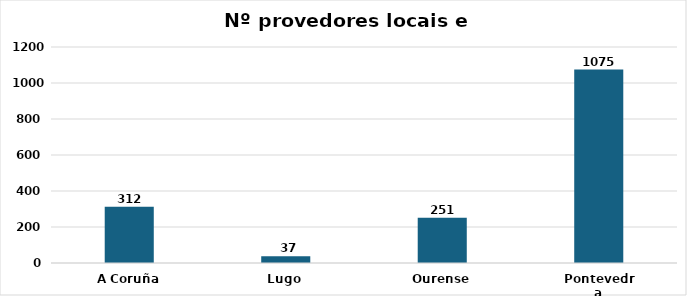
| Category | Series 0 |
|---|---|
| A Coruña | 312 |
| Lugo | 37 |
| Ourense | 251 |
| Pontevedra | 1075 |